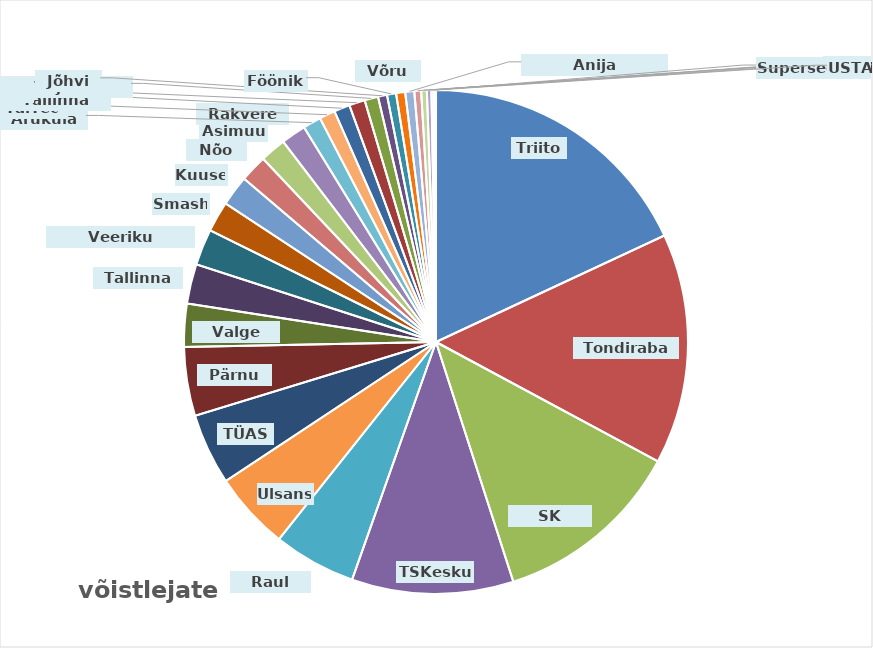
| Category | kokku |
|---|---|
| Triiton | 249 |
| Tondiraba SK | 204 |
| SK Fookus | 168 |
| TSKeskus | 143 |
| Raul Must | 73 |
| Ulsans | 69 |
| TÜASK | 63 |
| Pärnu SK | 61 |
| Valge Hani | 38 |
| Tallinna SK | 35 |
| Veeriku Badminton | 32 |
| Smash | 27 |
| Kuuse | 27 |
| Nõo SK | 24 |
| Asimuut | 23 |
| Rakvere SK | 22 |
| Aruküla SK | 16 |
| TalTech | 14 |
| Tallinna Kalev | 14 |
| Kiili | 14 |
| Viljandi Sulelised | 12 |
| Jõhvi SK | 8 |
| Fööniks | 8 |
| Võru SK | 8 |
| Anija Sulgpalliklubi | 8 |
| Puhja | 6 |
| Harko | 5 |
| Sarv | 4 |
| Viimsi SK | 2 |
| Superseeniorid | 2 |
| USTA | 0 |